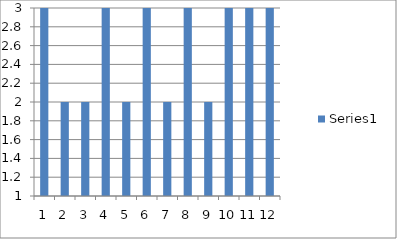
| Category | Series 0 |
|---|---|
| 0 | 3 |
| 1 | 2 |
| 2 | 2 |
| 3 | 3 |
| 4 | 2 |
| 5 | 3 |
| 6 | 2 |
| 7 | 3 |
| 8 | 2 |
| 9 | 3 |
| 10 | 3 |
| 11 | 3 |